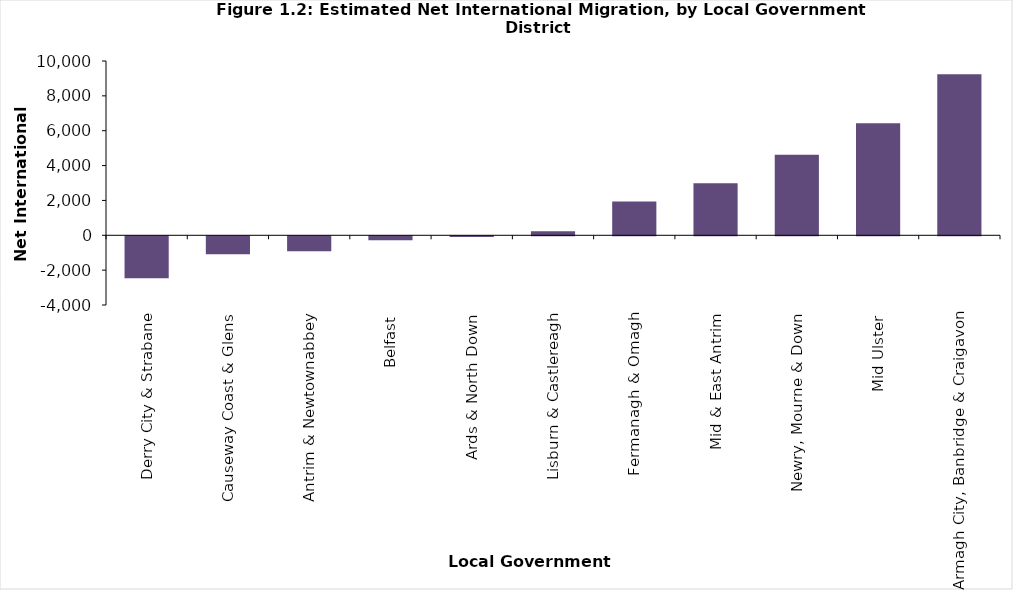
| Category | Total |
|---|---|
| Derry City & Strabane | -2409 |
| Causeway Coast & Glens | -1034 |
| Antrim & Newtownabbey | -858 |
| Belfast | -230 |
| Ards & North Down | -36 |
| Lisburn & Castlereagh | 238 |
| Fermanagh & Omagh | 1944 |
| Mid & East Antrim | 2984 |
| Newry, Mourne & Down | 4625 |
| Mid Ulster | 6424 |
| Armagh City, Banbridge & Craigavon | 9242 |